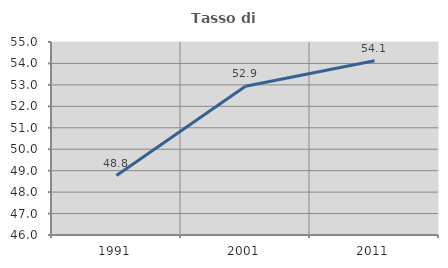
| Category | Tasso di occupazione   |
|---|---|
| 1991.0 | 48.77 |
| 2001.0 | 52.935 |
| 2011.0 | 54.124 |